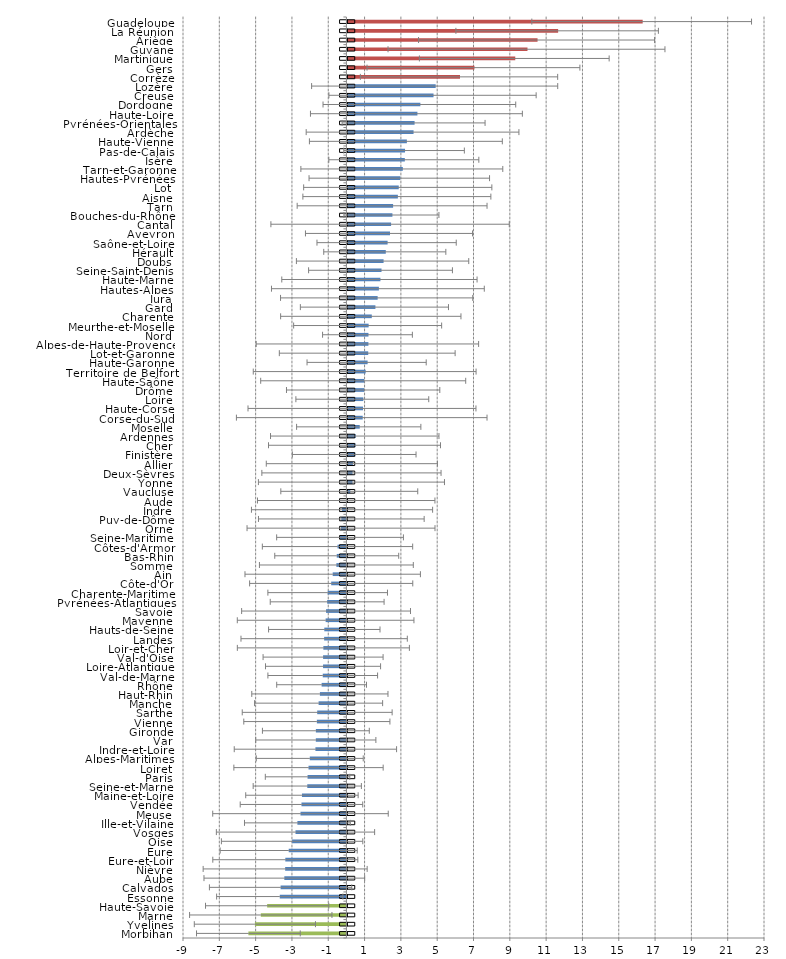
| Category | Series 0 | IC natio1 | IC natio2 |
|---|---|---|---|
| Morbihan | -5.399 | 0.404 | -0.404 |
| Yvelines | -5.041 | 0.404 | -0.404 |
| Marne | -4.716 | 0.404 | -0.404 |
| Haute-Savoie | -4.365 | 0.404 | -0.404 |
| Essonne | -3.671 | 0.404 | -0.404 |
| Calvados | -3.625 | 0.404 | -0.404 |
| Aube | -3.419 | 0.404 | -0.404 |
| Nièvre | -3.373 | 0.404 | -0.404 |
| Eure-et-Loir | -3.365 | 0.404 | -0.404 |
| Eure | -3.178 | 0.404 | -0.404 |
| Oise | -2.991 | 0.404 | -0.404 |
| Vosges | -2.804 | 0.404 | -0.404 |
| Ille-et-Vilaine | -2.7 | 0.404 | -0.404 |
| Meuse | -2.529 | 0.404 | -0.404 |
| Vendée | -2.475 | 0.404 | -0.404 |
| Maine-et-Loire | -2.449 | 0.404 | -0.404 |
| Seine-et-Marne | -2.155 | 0.404 | -0.404 |
| Paris | -2.14 | 0.404 | -0.404 |
| Loiret | -2.087 | 0.404 | -0.404 |
| Alpes-Maritimes | -2.018 | 0.404 | -0.404 |
| Indre-et-Loire | -1.707 | 0.404 | -0.404 |
| Var | -1.686 | 0.404 | -0.404 |
| Gironde | -1.683 | 0.404 | -0.404 |
| Vienne | -1.628 | 0.404 | -0.404 |
| Sarthe | -1.609 | 0.404 | -0.404 |
| Manche | -1.532 | 0.404 | -0.404 |
| Haut-Rhin | -1.461 | 0.404 | -0.404 |
| Rhône | -1.366 | 0.404 | -0.404 |
| Val-de-Marne | -1.303 | 0.404 | -0.404 |
| Loire-Atlantique | -1.287 | 0.404 | -0.404 |
| Val-d'Oise | -1.285 | 0.404 | -0.404 |
| Loir-et-Cher | -1.27 | 0.404 | -0.404 |
| Landes | -1.226 | 0.404 | -0.404 |
| Hauts-de-Seine | -1.218 | 0.404 | -0.404 |
| Mayenne | -1.145 | 0.404 | -0.404 |
| Savoie | -1.121 | 0.404 | -0.404 |
| Pyrénées-Atlantiques | -1.06 | 0.404 | -0.404 |
| Charente-Maritime | -1.032 | 0.404 | -0.404 |
| Côte-d'Or | -0.838 | 0.404 | -0.404 |
| Ain | -0.755 | 0.404 | -0.404 |
| Somme | -0.553 | 0.404 | -0.404 |
| Bas-Rhin | -0.533 | 0.404 | -0.404 |
| Côtes-d'Armor | -0.49 | 0.404 | -0.404 |
| Seine-Maritime | -0.35 | 0.404 | -0.404 |
| Orne | -0.296 | 0.404 | -0.404 |
| Puy-de-Dôme | -0.28 | 0.404 | -0.404 |
| Indre | -0.241 | 0.404 | -0.404 |
| Aude | -0.011 | 0.404 | -0.404 |
| Vaucluse | 0.158 | 0.404 | -0.404 |
| Yonne | 0.277 | 0.404 | -0.404 |
| Deux-Sèvres | 0.278 | 0.404 | -0.404 |
| Allier | 0.301 | 0.404 | -0.404 |
| Finistère | 0.43 | 0.404 | -0.404 |
| Cher | 0.445 | 0.404 | -0.404 |
| Ardennes | 0.459 | 0.404 | -0.404 |
| Moselle | 0.679 | 0.404 | -0.404 |
| Corse-du-Sud | 0.843 | 0.404 | -0.404 |
| Haute-Corse | 0.858 | 0.404 | -0.404 |
| Loire | 0.876 | 0.404 | -0.404 |
| Drôme | 0.922 | 0.404 | -0.404 |
| Haute-Saône | 0.925 | 0.404 | -0.404 |
| Territoire de Belfort | 1.006 | 0.404 | -0.404 |
| Haute-Garonne | 1.113 | 0.404 | -0.404 |
| Lot-et-Garonne | 1.147 | 0.404 | -0.404 |
| Alpes-de-Haute-Provence | 1.157 | 0.404 | -0.404 |
| Nord | 1.16 | 0.404 | -0.404 |
| Meurthe-et-Moselle | 1.17 | 0.404 | -0.404 |
| Charente | 1.343 | 0.404 | -0.404 |
| Gard | 1.543 | 0.404 | -0.404 |
| Jura | 1.665 | 0.404 | -0.404 |
| Hautes-Alpes | 1.734 | 0.404 | -0.404 |
| Haute-Marne | 1.819 | 0.404 | -0.404 |
| Seine-Saint-Denis | 1.879 | 0.404 | -0.404 |
| Doubs | 1.992 | 0.404 | -0.404 |
| Hérault | 2.114 | 0.404 | -0.404 |
| Saône-et-Loire | 2.214 | 0.404 | -0.404 |
| Aveyron | 2.346 | 0.404 | -0.404 |
| Cantal | 2.405 | 0.404 | -0.404 |
| Bouches-du-Rhône | 2.479 | 0.404 | -0.404 |
| Tarn | 2.517 | 0.404 | -0.404 |
| Aisne | 2.78 | 0.404 | -0.404 |
| Lot | 2.828 | 0.404 | -0.404 |
| Hautes-Pyrénées | 2.913 | 0.404 | -0.404 |
| Tarn-et-Garonne | 3.053 | 0.404 | -0.404 |
| Isère | 3.163 | 0.404 | -0.404 |
| Pas-de-Calais | 3.175 | 0.404 | -0.404 |
| Haute-Vienne | 3.275 | 0.404 | -0.404 |
| Ardèche | 3.643 | 0.404 | -0.404 |
| Pyrénées-Orientales | 3.7 | 0.404 | -0.404 |
| Haute-Loire | 3.856 | 0.404 | -0.404 |
| Dordogne | 4.019 | 0.404 | -0.404 |
| Creuse | 4.743 | 0.404 | -0.404 |
| Lozère | 4.861 | 0.404 | -0.404 |
| Corrèze | 6.202 | 0.404 | -0.404 |
| Gers | 6.998 | 0.404 | -0.404 |
| Martinique | 9.245 | 0.404 | -0.404 |
| Guyane | 9.919 | 0.404 | -0.404 |
| Ariège | 10.473 | 0.404 | -0.404 |
| La Réunion | 11.607 | 0.404 | -0.404 |
| Guadeloupe | 16.263 | 0.404 | -0.404 |